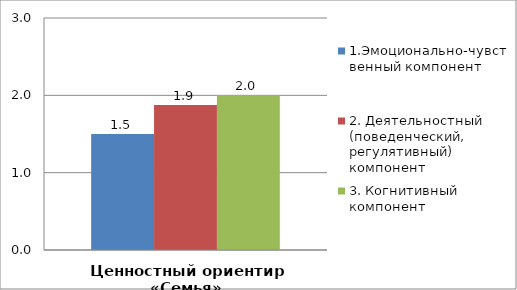
| Category | 1.Эмоционально-чувственный компонент | 2. Деятельностный (поведенческий, регулятивный) компонент | 3. Когнитивный компонент |
|---|---|---|---|
| Ценностный ориентир «Семья» | 1.5 | 1.875 | 2 |